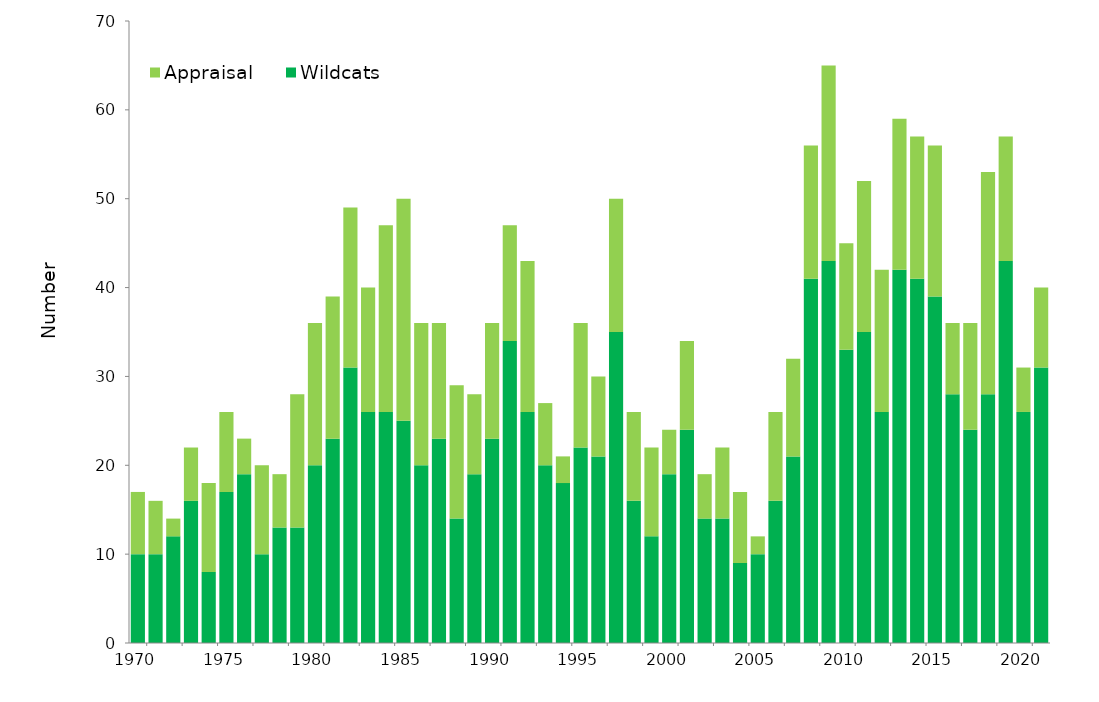
| Category | Wildcats | Appraisal  |
|---|---|---|
| 1970.0 | 10 | 7 |
| 1971.0 | 10 | 6 |
| 1972.0 | 12 | 2 |
| 1973.0 | 16 | 6 |
| 1974.0 | 8 | 10 |
| 1975.0 | 17 | 9 |
| 1976.0 | 19 | 4 |
| 1977.0 | 10 | 10 |
| 1978.0 | 13 | 6 |
| 1979.0 | 13 | 15 |
| 1980.0 | 20 | 16 |
| 1981.0 | 23 | 16 |
| 1982.0 | 31 | 18 |
| 1983.0 | 26 | 14 |
| 1984.0 | 26 | 21 |
| 1985.0 | 25 | 25 |
| 1986.0 | 20 | 16 |
| 1987.0 | 23 | 13 |
| 1988.0 | 14 | 15 |
| 1989.0 | 19 | 9 |
| 1990.0 | 23 | 13 |
| 1991.0 | 34 | 13 |
| 1992.0 | 26 | 17 |
| 1993.0 | 20 | 7 |
| 1994.0 | 18 | 3 |
| 1995.0 | 22 | 14 |
| 1996.0 | 21 | 9 |
| 1997.0 | 35 | 15 |
| 1998.0 | 16 | 10 |
| 1999.0 | 12 | 10 |
| 2000.0 | 19 | 5 |
| 2001.0 | 24 | 10 |
| 2002.0 | 14 | 5 |
| 2003.0 | 14 | 8 |
| 2004.0 | 9 | 8 |
| 2005.0 | 10 | 2 |
| 2006.0 | 16 | 10 |
| 2007.0 | 21 | 11 |
| 2008.0 | 41 | 15 |
| 2009.0 | 43 | 22 |
| 2010.0 | 33 | 12 |
| 2011.0 | 35 | 17 |
| 2012.0 | 26 | 16 |
| 2013.0 | 42 | 17 |
| 2014.0 | 41 | 16 |
| 2015.0 | 39 | 17 |
| 2016.0 | 28 | 8 |
| 2017.0 | 24 | 12 |
| 2018.0 | 28 | 25 |
| 2019.0 | 43 | 14 |
| 2020.0 | 26 | 5 |
| 2021.0 | 31 | 9 |